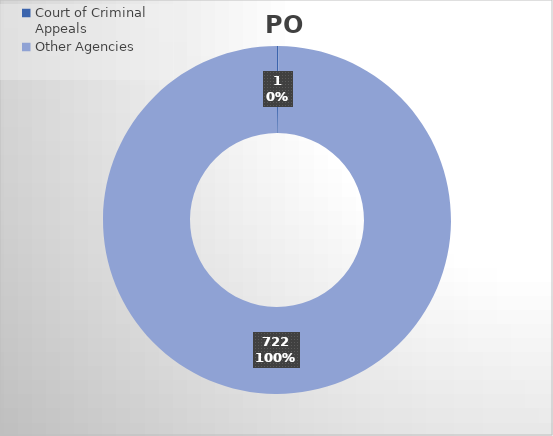
| Category | PO Lines |
|---|---|
| Court of Criminal Appeals | 1 |
| Other Agencies | 722 |